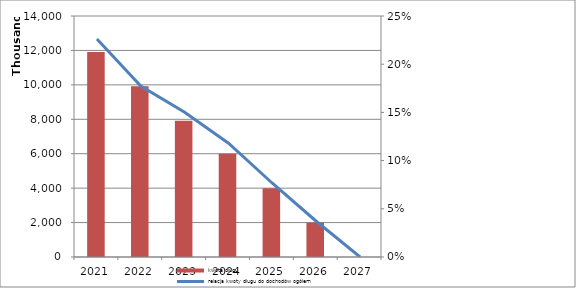
| Category | kwota długu |
|---|---|
| 2021.0 | 11915000 |
| 2022.0 | 9915000 |
| 2023.0 | 7915000 |
| 2024.0 | 6000000 |
| 2025.0 | 4000000 |
| 2026.0 | 2000000 |
| 2027.0 | 0 |